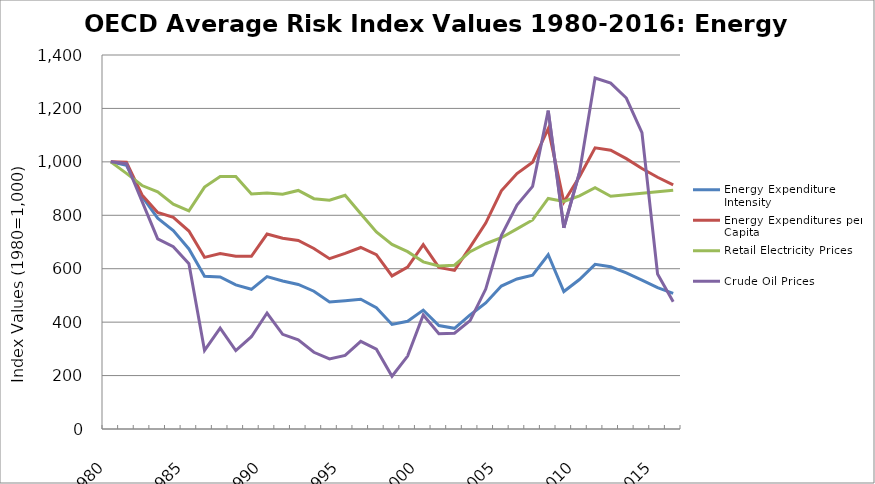
| Category | Energy Expenditure Intensity | Energy Expenditures per Capita | Retail Electricity Prices | Crude Oil Prices |
|---|---|---|---|---|
| 1980.0 | 1000 | 1000 | 1000 | 1000 |
| 1981.0 | 986.943 | 998.807 | 957.037 | 993.161 |
| 1982.0 | 870.394 | 875.913 | 911.357 | 851.876 |
| 1983.0 | 789.133 | 810.245 | 887.499 | 711.763 |
| 1984.0 | 742.78 | 792.026 | 841.87 | 682.178 |
| 1985.0 | 673.928 | 740.92 | 816.315 | 618.882 |
| 1986.0 | 571.791 | 642.465 | 905.51 | 293.93 |
| 1987.0 | 568.941 | 656.536 | 944.922 | 377.54 |
| 1988.0 | 539.316 | 646.695 | 945.189 | 293.506 |
| 1989.0 | 522.961 | 646.346 | 879.476 | 345.43 |
| 1990.0 | 570.727 | 729.597 | 883.744 | 434.161 |
| 1991.0 | 554.299 | 713.778 | 878.761 | 354.388 |
| 1992.0 | 541.202 | 705.828 | 892.959 | 334.04 |
| 1993.0 | 515.647 | 675.867 | 862.146 | 287.266 |
| 1994.0 | 475.604 | 637.531 | 856.131 | 262.265 |
| 1995.0 | 480.423 | 657.107 | 874.921 | 275.697 |
| 1996.0 | 485.989 | 679.436 | 805.621 | 328.341 |
| 1997.0 | 454.312 | 652.506 | 737.354 | 298.885 |
| 1998.0 | 391.245 | 572.986 | 690.818 | 197.426 |
| 1999.0 | 403.247 | 605.75 | 663.939 | 272.782 |
| 2000.0 | 445.066 | 690.301 | 625.605 | 427.038 |
| 2001.0 | 387.295 | 604.76 | 610.561 | 356.333 |
| 2002.0 | 376.982 | 593.747 | 613.059 | 358.553 |
| 2003.0 | 426.937 | 681.018 | 663.737 | 405.842 |
| 2004.0 | 471.624 | 770.814 | 693.528 | 523.812 |
| 2005.0 | 535.093 | 891.447 | 716.075 | 723.816 |
| 2006.0 | 561.481 | 956.32 | 749.264 | 838.521 |
| 2007.0 | 575.989 | 998.826 | 782.513 | 908.042 |
| 2008.0 | 652.161 | 1124.113 | 862.874 | 1191.778 |
| 2009.0 | 514.48 | 849.208 | 851.653 | 753.307 |
| 2010.0 | 559.57 | 944.291 | 872.654 | 959.627 |
| 2011.0 | 616.192 | 1052.465 | 902.931 | 1314.007 |
| 2012.0 | 607.151 | 1043.529 | 871.408 | 1294.532 |
| 2013.0 | 584.28 | 1011.991 | 876.874 | 1238.924 |
| 2014.0 | 556.898 | 974.986 | 882.374 | 1109.604 |
| 2015.0 | 529.115 | 942.431 | 887.909 | 580.348 |
| 2016.0 | 507.953 | 914.12 | 893.479 | 476.755 |